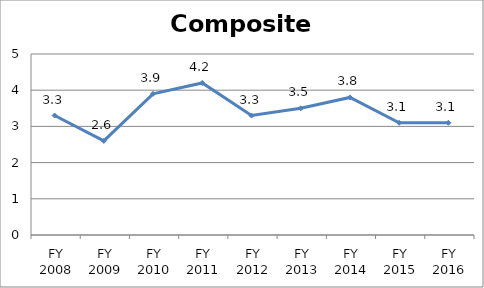
| Category | Composite score |
|---|---|
| FY 2016 | 3.1 |
| FY 2015 | 3.1 |
| FY 2014 | 3.8 |
| FY 2013 | 3.5 |
| FY 2012 | 3.3 |
| FY 2011 | 4.2 |
| FY 2010 | 3.9 |
| FY 2009 | 2.6 |
| FY 2008 | 3.3 |